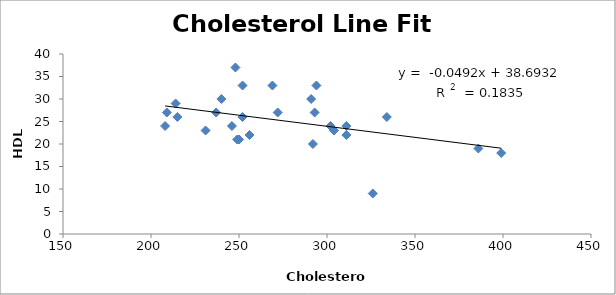
| Category | HDL |
|---|---|
| 326.0 | 9 |
| 399.0 | 18 |
| 386.0 | 19 |
| 292.0 | 20 |
| 250.0 | 21 |
| 249.0 | 21 |
| 311.0 | 22 |
| 256.0 | 22 |
| 304.0 | 23 |
| 231.0 | 23 |
| 302.0 | 24 |
| 208.0 | 24 |
| 246.0 | 24 |
| 311.0 | 24 |
| 215.0 | 26 |
| 334.0 | 26 |
| 252.0 | 26 |
| 209.0 | 27 |
| 272.0 | 27 |
| 293.0 | 27 |
| 237.0 | 27 |
| 214.0 | 29 |
| 291.0 | 30 |
| 240.0 | 30 |
| 269.0 | 33 |
| 252.0 | 33 |
| 294.0 | 33 |
| 248.0 | 37 |